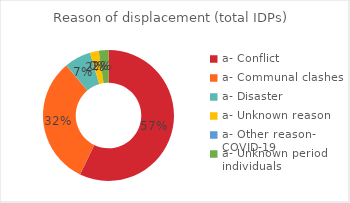
| Category | Series 0 |
|---|---|
| a- Conflict | 923519 |
| a- Communal clashes | 512262 |
| a- Disaster | 106329 |
| a- Unknown reason | 34838 |
| a- Other reason- COVID-19 | 384 |
| a- Unknown period individuals | 38433 |